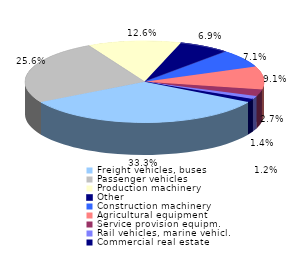
| Category | Series 0 |
|---|---|
| Freight vehicles, buses | 0.333 |
| Passenger vehicles | 0.256 |
| Production machinery | 0.126 |
| Other | 0.069 |
| Construction machinery | 0.071 |
| Agricultural equipment | 0.091 |
| Service provision equipm. | 0.027 |
| Rail vehicles, marine vehicl. | 0.012 |
| Commercial real estate | 0.014 |